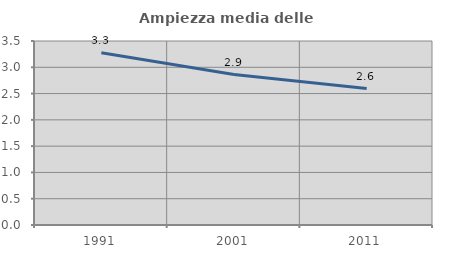
| Category | Ampiezza media delle famiglie |
|---|---|
| 1991.0 | 3.278 |
| 2001.0 | 2.862 |
| 2011.0 | 2.595 |